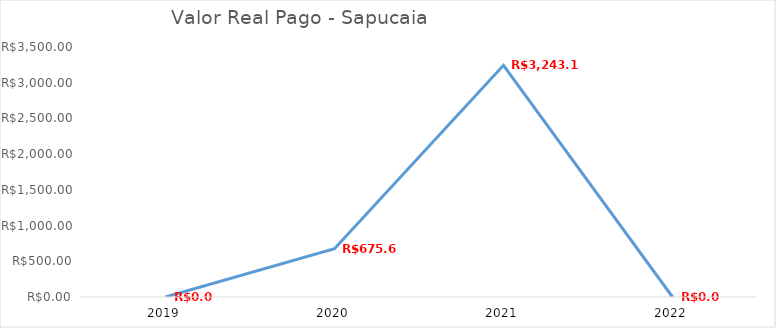
| Category | Series 0 |
|---|---|
| 2019.0 | 0 |
| 2020.0 | 675.65 |
| 2021.0 | 3243.12 |
| 2022.0 | 0 |